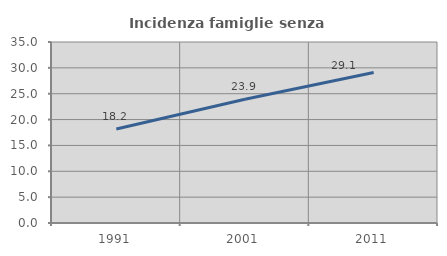
| Category | Incidenza famiglie senza nuclei |
|---|---|
| 1991.0 | 18.182 |
| 2001.0 | 23.938 |
| 2011.0 | 29.119 |